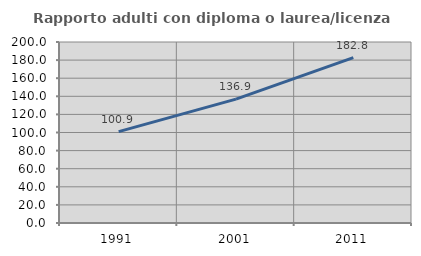
| Category | Rapporto adulti con diploma o laurea/licenza media  |
|---|---|
| 1991.0 | 100.907 |
| 2001.0 | 136.927 |
| 2011.0 | 182.762 |